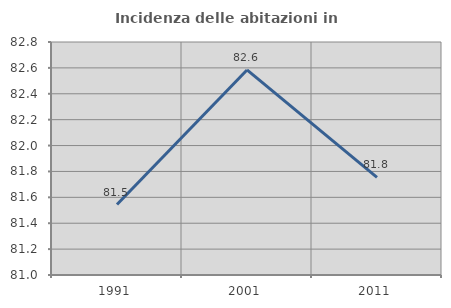
| Category | Incidenza delle abitazioni in proprietà  |
|---|---|
| 1991.0 | 81.545 |
| 2001.0 | 82.584 |
| 2011.0 | 81.754 |